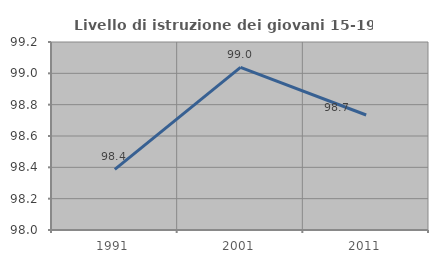
| Category | Livello di istruzione dei giovani 15-19 anni |
|---|---|
| 1991.0 | 98.387 |
| 2001.0 | 99.038 |
| 2011.0 | 98.734 |